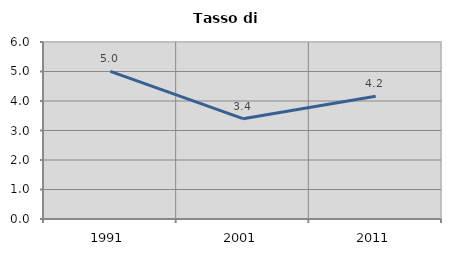
| Category | Tasso di disoccupazione   |
|---|---|
| 1991.0 | 5.007 |
| 2001.0 | 3.401 |
| 2011.0 | 4.163 |